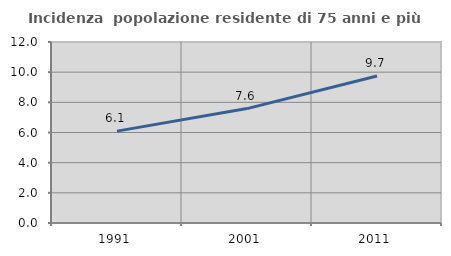
| Category | Incidenza  popolazione residente di 75 anni e più |
|---|---|
| 1991.0 | 6.091 |
| 2001.0 | 7.585 |
| 2011.0 | 9.746 |